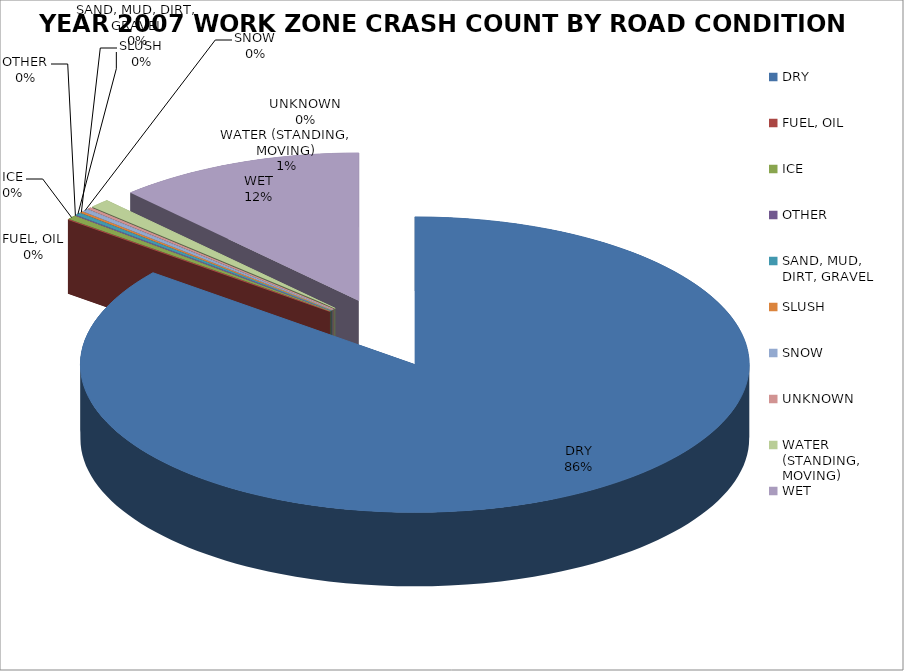
| Category | YEAR 2022 WORK ZONE CRASH COUNT* |
|---|---|
| DRY | 0.857 |
| FUEL, OIL | 0 |
| ICE | 0.004 |
| OTHER | 0 |
| SAND, MUD, DIRT, GRAVEL | 0.003 |
| SLUSH | 0.001 |
| SNOW | 0.003 |
| UNKNOWN | 0.002 |
| WATER (STANDING, MOVING) | 0.01 |
| WET | 0.12 |